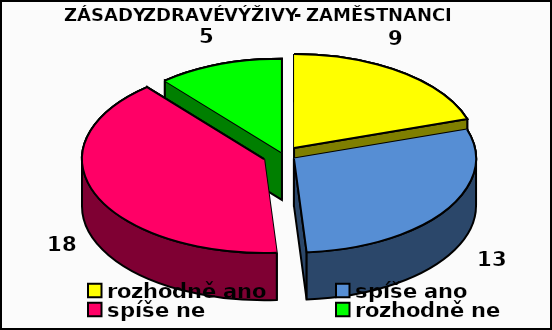
| Category | Series 0 |
|---|---|
| rozhodně ano | 9 |
| spíše ano | 13 |
| spíše ne | 18 |
| rozhodně ne | 5 |